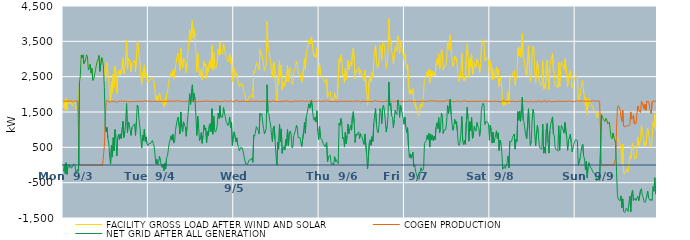
| Category | FACILITY GROSS LOAD AFTER WIND AND SOLAR | COGEN PRODUCTION | NET GRID AFTER ALL GENERATION |
|---|---|---|---|
|  Mon  9/3 | 1620 | 1800 | -180 |
|  Mon  9/3 | 1828 | 1808 | 20 |
|  Mon  9/3 | 1564 | 1807 | -243 |
|  Mon  9/3 | 1877 | 1812 | 65 |
|  Mon  9/3 | 1547 | 1811 | -264 |
|  Mon  9/3 | 1786 | 1816 | -30 |
|  Mon  9/3 | 1826 | 1805 | 21 |
|  Mon  9/3 | 1730 | 1797 | -67 |
|  Mon  9/3 | 1804 | 1817 | -13 |
|  Mon  9/3 | 1721 | 1812 | -91 |
|  Mon  9/3 | 1666 | 1784 | -118 |
|  Mon  9/3 | 1783 | 1788 | -5 |
|  Mon  9/3 | 1842 | 1810 | 32 |
|  Mon  9/3 | 1788 | 1802 | -14 |
|  Mon  9/3 | 1573 | 1814 | -241 |
|  Mon  9/3 | 1558 | 1807 | -249 |
|  Mon  9/3 | 1674 | 1800 | -126 |
|  Mon  9/3 | 1615 | 1794 | -179 |
|  Mon  9/3 | 2334 | 0 | 2334 |
|  Mon  9/3 | 2529 | 0 | 2529 |
|  Mon  9/3 | 3106 | 0 | 3106 |
|  Mon  9/3 | 3029 | 0 | 3029 |
|  Mon  9/3 | 3119 | 0 | 3119 |
|  Mon  9/3 | 2869 | 0 | 2869 |
|  Mon  9/3 | 2872 | 0 | 2872 |
|  Mon  9/3 | 2990 | 0 | 2990 |
|  Mon  9/3 | 3119 | 0 | 3119 |
|  Mon  9/3 | 3068 | 0 | 3068 |
|  Mon  9/3 | 2688 | 0 | 2688 |
|  Mon  9/3 | 2748 | 0 | 2748 |
|  Mon  9/3 | 2850 | 0 | 2850 |
|  Mon  9/3 | 2611 | 0 | 2611 |
|  Mon  9/3 | 2733 | 0 | 2733 |
|  Mon  9/3 | 2392 | 0 | 2392 |
|  Mon  9/3 | 2431 | 0 | 2431 |
|  Mon  9/3 | 2545 | 0 | 2545 |
|  Mon  9/3 | 2681 | 0 | 2681 |
|  Mon  9/3 | 2830 | 0 | 2830 |
|  Mon  9/3 | 2939 | 0 | 2939 |
|  Mon  9/3 | 2993 | 0 | 2993 |
|  Mon  9/3 | 3101 | 0 | 3101 |
|  Mon  9/3 | 2649 | 0 | 2649 |
|  Mon  9/3 | 2665 | 0 | 2665 |
|  Mon  9/3 | 3035 | 0 | 3035 |
|  Mon  9/3 | 2955 | 0 | 2955 |
|  Mon  9/3 | 2806 | 0 | 2806 |
|  Mon  9/3 | 2719 | 530 | 2189 |
|  Mon  9/3 | 2361 | 1263 | 1098 |
|  Mon  9/3 | 2733 | 1798 | 935 |
|  Mon  9/3 | 2897 | 1831 | 1066 |
|  Mon  9/3 | 2556 | 1801 | 755 |
|  Mon  9/3 | 2422 | 1802 | 620 |
|  Mon  9/3 | 2032 | 1781 | 251 |
|  Mon  9/3 | 1816 | 1792 | 24 |
|  Mon  9/3 | 2366 | 1805 | 561 |
|  Mon  9/3 | 2033 | 1809 | 224 |
|  Mon  9/3 | 2572 | 1798 | 774 |
|  Mon  9/3 | 2197 | 1798 | 399 |
|  Mon  9/3 | 2803 | 1801 | 1002 |
|  Mon  9/3 | 2586 | 1807 | 779 |
|  Mon  9/3 | 2029 | 1775 | 254 |
|  Mon  9/3 | 2541 | 1780 | 761 |
|  Mon  9/3 | 2670 | 1802 | 868 |
|  Mon  9/3 | 2544 | 1816 | 728 |
|  Mon  9/3 | 2690 | 1810 | 880 |
|  Mon  9/3 | 2559 | 1810 | 749 |
|  Mon  9/3 | 2541 | 1806 | 735 |
|  Mon  9/3 | 3022 | 1787 | 1235 |
|  Mon  9/3 | 2579 | 1803 | 776 |
|  Mon  9/3 | 2731 | 1799 | 932 |
|  Mon  9/3 | 3030 | 1807 | 1223 |
|  Mon  9/3 | 3539 | 1799 | 1740 |
|  Mon  9/3 | 2712 | 1795 | 917 |
|  Mon  9/3 | 3023 | 1803 | 1220 |
|  Mon  9/3 | 2942 | 1791 | 1151 |
|  Mon  9/3 | 2973 | 1795 | 1178 |
|  Mon  9/3 | 2633 | 1795 | 838 |
|  Mon  9/3 | 2866 | 1804 | 1062 |
|  Mon  9/3 | 2895 | 1795 | 1100 |
|  Mon  9/3 | 2915 | 1806 | 1109 |
|  Mon  9/3 | 2965 | 1800 | 1165 |
|  Mon  9/3 | 2630 | 1796 | 834 |
|  Mon  9/3 | 3017 | 1799 | 1218 |
|  Mon  9/3 | 3505 | 1808 | 1697 |
|  Mon  9/3 | 3436 | 1800 | 1636 |
|  Mon  9/3 | 3077 | 1797 | 1280 |
|  Mon  9/3 | 2880 | 1804 | 1076 |
|  Mon  9/3 | 2576 | 1798 | 778 |
|  Mon  9/3 | 2275 | 1793 | 482 |
|  Mon  9/3 | 2637 | 1800 | 837 |
|  Mon  9/3 | 2498 | 1810 | 688 |
|  Mon  9/3 | 2820 | 1804 | 1016 |
|  Mon  9/3 | 2486 | 1818 | 668 |
|  Mon  9/3 | 2588 | 1793 | 795 |
|  Mon  9/3 | 2414 | 1806 | 608 |
|  Mon  9/3 | 2339 | 1795 | 544 |
|  Tue  9/4 | 2403 | 1800 | 603 |
|  Tue  9/4 | 2415 | 1810 | 605 |
|  Tue  9/4 | 2418 | 1808 | 610 |
|  Tue  9/4 | 2394 | 1809 | 585 |
|  Tue  9/4 | 2489 | 1795 | 694 |
|  Tue  9/4 | 2422 | 1817 | 605 |
|  Tue  9/4 | 2332 | 1806 | 526 |
|  Tue  9/4 | 2324 | 1795 | 529 |
|  Tue  9/4 | 1833 | 1803 | 30 |
|  Tue  9/4 | 1961 | 1804 | 157 |
|  Tue  9/4 | 1810 | 1803 | 7 |
|  Tue  9/4 | 1873 | 1799 | 74 |
|  Tue  9/4 | 2046 | 1800 | 246 |
|  Tue  9/4 | 1919 | 1796 | 123 |
|  Tue  9/4 | 1799 | 1800 | -1 |
|  Tue  9/4 | 1749 | 1820 | -71 |
|  Tue  9/4 | 1818 | 1789 | 29 |
|  Tue  9/4 | 1653 | 1811 | -158 |
|  Tue  9/4 | 1860 | 1808 | 52 |
|  Tue  9/4 | 1699 | 1809 | -110 |
|  Tue  9/4 | 2014 | 1805 | 209 |
|  Tue  9/4 | 2064 | 1818 | 246 |
|  Tue  9/4 | 2255 | 1811 | 444 |
|  Tue  9/4 | 2422 | 1801 | 621 |
|  Tue  9/4 | 2444 | 1804 | 640 |
|  Tue  9/4 | 2607 | 1779 | 828 |
|  Tue  9/4 | 2503 | 1800 | 703 |
|  Tue  9/4 | 2691 | 1821 | 870 |
|  Tue  9/4 | 2432 | 1813 | 619 |
|  Tue  9/4 | 2451 | 1796 | 655 |
|  Tue  9/4 | 2786 | 1806 | 980 |
|  Tue  9/4 | 2940 | 1802 | 1138 |
|  Tue  9/4 | 3099 | 1818 | 1281 |
|  Tue  9/4 | 3159 | 1806 | 1353 |
|  Tue  9/4 | 2923 | 1811 | 1112 |
|  Tue  9/4 | 2681 | 1802 | 879 |
|  Tue  9/4 | 3297 | 1796 | 1501 |
|  Tue  9/4 | 2869 | 1794 | 1075 |
|  Tue  9/4 | 2748 | 1805 | 943 |
|  Tue  9/4 | 3029 | 1806 | 1223 |
|  Tue  9/4 | 2933 | 1799 | 1134 |
|  Tue  9/4 | 2885 | 1796 | 1089 |
|  Tue  9/4 | 2612 | 1799 | 813 |
|  Tue  9/4 | 2873 | 1799 | 1074 |
|  Tue  9/4 | 3221 | 1813 | 1408 |
|  Tue  9/4 | 3468 | 1794 | 1674 |
|  Tue  9/4 | 3832 | 1811 | 2021 |
|  Tue  9/4 | 3516 | 1799 | 1717 |
|  Tue  9/4 | 3510 | 1817 | 1693 |
|  Tue  9/4 | 4083 | 1815 | 2268 |
|  Tue  9/4 | 3582 | 1780 | 1802 |
|  Tue  9/4 | 3843 | 1818 | 2025 |
|  Tue  9/4 | 3658 | 1813 | 1845 |
|  Tue  9/4 | 3132 | 1788 | 1344 |
|  Tue  9/4 | 2648 | 1811 | 837 |
|  Tue  9/4 | 3167 | 1791 | 1376 |
|  Tue  9/4 | 2890 | 1814 | 1076 |
|  Tue  9/4 | 2500 | 1805 | 695 |
|  Tue  9/4 | 2585 | 1819 | 766 |
|  Tue  9/4 | 2726 | 1806 | 920 |
|  Tue  9/4 | 2417 | 1804 | 613 |
|  Tue  9/4 | 2632 | 1794 | 838 |
|  Tue  9/4 | 2938 | 1805 | 1133 |
|  Tue  9/4 | 2800 | 1811 | 989 |
|  Tue  9/4 | 2861 | 1811 | 1050 |
|  Tue  9/4 | 2443 | 1810 | 633 |
|  Tue  9/4 | 2755 | 1810 | 945 |
|  Tue  9/4 | 2643 | 1809 | 834 |
|  Tue  9/4 | 2901 | 1792 | 1109 |
|  Tue  9/4 | 2971 | 1801 | 1170 |
|  Tue  9/4 | 2755 | 1811 | 944 |
|  Tue  9/4 | 3391 | 1796 | 1595 |
|  Tue  9/4 | 2686 | 1814 | 872 |
|  Tue  9/4 | 3187 | 1806 | 1381 |
|  Tue  9/4 | 2787 | 1800 | 987 |
|  Tue  9/4 | 2733 | 1803 | 930 |
|  Tue  9/4 | 2790 | 1794 | 996 |
|  Tue  9/4 | 2943 | 1805 | 1138 |
|  Tue  9/4 | 3278 | 1808 | 1470 |
|  Tue  9/4 | 3106 | 1790 | 1316 |
|  Tue  9/4 | 3485 | 1807 | 1678 |
|  Tue  9/4 | 3154 | 1802 | 1352 |
|  Tue  9/4 | 3164 | 1796 | 1368 |
|  Tue  9/4 | 3153 | 1796 | 1357 |
|  Tue  9/4 | 3429 | 1806 | 1623 |
|  Tue  9/4 | 3274 | 1809 | 1465 |
|  Tue  9/4 | 3175 | 1804 | 1371 |
|  Tue  9/4 | 3036 | 1808 | 1228 |
|  Tue  9/4 | 3043 | 1805 | 1238 |
|  Tue  9/4 | 2922 | 1806 | 1116 |
|  Tue  9/4 | 3005 | 1804 | 1201 |
|  Tue  9/4 | 3146 | 1796 | 1350 |
|  Tue  9/4 | 2869 | 1817 | 1052 |
|  Tue  9/4 | 3039 | 1823 | 1216 |
|  Tue  9/4 | 2352 | 1804 | 548 |
|  Tue  9/4 | 2618 | 1782 | 836 |
|  Wed  9/5 | 2733 | 1795 | 938 |
|  Wed  9/5 | 2749 | 1809 | 940 |
|  Wed  9/5 | 2467 | 1806 | 661 |
|  Wed  9/5 | 2589 | 1822 | 767 |
|  Wed  9/5 | 2377 | 1802 | 575 |
|  Wed  9/5 | 2296 | 1802 | 494 |
|  Wed  9/5 | 2210 | 1812 | 398 |
|  Wed  9/5 | 2285 | 1797 | 488 |
|  Wed  9/5 | 2275 | 1807 | 468 |
|  Wed  9/5 | 2295 | 1809 | 486 |
|  Wed  9/5 | 2192 | 1802 | 390 |
|  Wed  9/5 | 2056 | 1809 | 247 |
|  Wed  9/5 | 2026 | 1796 | 230 |
|  Wed  9/5 | 1825 | 1798 | 27 |
|  Wed  9/5 | 1846 | 1799 | 47 |
|  Wed  9/5 | 1825 | 1799 | 26 |
|  Wed  9/5 | 1802 | 1801 | 1 |
|  Wed  9/5 | 1947 | 1802 | 145 |
|  Wed  9/5 | 1935 | 1805 | 130 |
|  Wed  9/5 | 1949 | 1801 | 148 |
|  Wed  9/5 | 1991 | 1789 | 202 |
|  Wed  9/5 | 1890 | 1814 | 76 |
|  Wed  9/5 | 2654 | 1804 | 850 |
|  Wed  9/5 | 2609 | 1794 | 815 |
|  Wed  9/5 | 2600 | 1796 | 804 |
|  Wed  9/5 | 2899 | 1813 | 1086 |
|  Wed  9/5 | 2824 | 1804 | 1020 |
|  Wed  9/5 | 2764 | 1788 | 976 |
|  Wed  9/5 | 2686 | 1804 | 882 |
|  Wed  9/5 | 3266 | 1803 | 1463 |
|  Wed  9/5 | 3226 | 1803 | 1423 |
|  Wed  9/5 | 3253 | 1801 | 1452 |
|  Wed  9/5 | 3028 | 1811 | 1217 |
|  Wed  9/5 | 2845 | 1806 | 1039 |
|  Wed  9/5 | 2674 | 1798 | 876 |
|  Wed  9/5 | 2760 | 1802 | 958 |
|  Wed  9/5 | 2825 | 1803 | 1022 |
|  Wed  9/5 | 4068 | 1798 | 2270 |
|  Wed  9/5 | 3284 | 1798 | 1486 |
|  Wed  9/5 | 3254 | 1806 | 1448 |
|  Wed  9/5 | 3054 | 1803 | 1251 |
|  Wed  9/5 | 2922 | 1790 | 1132 |
|  Wed  9/5 | 2641 | 1806 | 835 |
|  Wed  9/5 | 2477 | 1813 | 664 |
|  Wed  9/5 | 2838 | 1791 | 1047 |
|  Wed  9/5 | 2912 | 1807 | 1105 |
|  Wed  9/5 | 2518 | 1801 | 717 |
|  Wed  9/5 | 2071 | 1799 | 272 |
|  Wed  9/5 | 1788 | 1795 | -7 |
|  Wed  9/5 | 2451 | 1800 | 651 |
|  Wed  9/5 | 2266 | 1819 | 447 |
|  Wed  9/5 | 2950 | 1794 | 1156 |
|  Wed  9/5 | 2477 | 1810 | 667 |
|  Wed  9/5 | 2828 | 1805 | 1023 |
|  Wed  9/5 | 2133 | 1803 | 330 |
|  Wed  9/5 | 2292 | 1805 | 487 |
|  Wed  9/5 | 2335 | 1813 | 522 |
|  Wed  9/5 | 2227 | 1804 | 423 |
|  Wed  9/5 | 2526 | 1804 | 722 |
|  Wed  9/5 | 2360 | 1815 | 545 |
|  Wed  9/5 | 2814 | 1804 | 1010 |
|  Wed  9/5 | 2359 | 1808 | 551 |
|  Wed  9/5 | 2696 | 1793 | 903 |
|  Wed  9/5 | 2751 | 1788 | 963 |
|  Wed  9/5 | 2677 | 1800 | 877 |
|  Wed  9/5 | 2272 | 1788 | 484 |
|  Wed  9/5 | 2309 | 1794 | 515 |
|  Wed  9/5 | 2630 | 1804 | 826 |
|  Wed  9/5 | 2624 | 1812 | 812 |
|  Wed  9/5 | 2792 | 1808 | 984 |
|  Wed  9/5 | 2932 | 1807 | 1125 |
|  Wed  9/5 | 2851 | 1801 | 1050 |
|  Wed  9/5 | 2582 | 1803 | 779 |
|  Wed  9/5 | 2567 | 1812 | 755 |
|  Wed  9/5 | 2576 | 1798 | 778 |
|  Wed  9/5 | 2432 | 1805 | 627 |
|  Wed  9/5 | 2335 | 1814 | 521 |
|  Wed  9/5 | 2312 | 1815 | 497 |
|  Wed  9/5 | 2730 | 1801 | 929 |
|  Wed  9/5 | 3010 | 1798 | 1212 |
|  Wed  9/5 | 2694 | 1797 | 897 |
|  Wed  9/5 | 3150 | 1809 | 1341 |
|  Wed  9/5 | 3264 | 1805 | 1459 |
|  Wed  9/5 | 3415 | 1803 | 1612 |
|  Wed  9/5 | 3547 | 1815 | 1732 |
|  Wed  9/5 | 3417 | 1809 | 1608 |
|  Wed  9/5 | 3403 | 1814 | 1589 |
|  Wed  9/5 | 3621 | 1792 | 1829 |
|  Wed  9/5 | 3396 | 1805 | 1591 |
|  Wed  9/5 | 3134 | 1807 | 1327 |
|  Wed  9/5 | 3070 | 1807 | 1263 |
|  Wed  9/5 | 3150 | 1795 | 1355 |
|  Wed  9/5 | 3045 | 1822 | 1223 |
|  Wed  9/5 | 3322 | 1789 | 1533 |
|  Wed  9/5 | 2755 | 1808 | 947 |
|  Wed  9/5 | 2533 | 1819 | 714 |
|  Thu  9/6 | 2885 | 1792 | 1093 |
|  Thu  9/6 | 2576 | 1794 | 782 |
|  Thu  9/6 | 2557 | 1797 | 760 |
|  Thu  9/6 | 2492 | 1796 | 696 |
|  Thu  9/6 | 2424 | 1805 | 619 |
|  Thu  9/6 | 2450 | 1817 | 633 |
|  Thu  9/6 | 2327 | 1815 | 512 |
|  Thu  9/6 | 2313 | 1802 | 511 |
|  Thu  9/6 | 2441 | 1803 | 638 |
|  Thu  9/6 | 1899 | 1811 | 88 |
|  Thu  9/6 | 2025 | 1787 | 238 |
|  Thu  9/6 | 2024 | 1801 | 223 |
|  Thu  9/6 | 2085 | 1807 | 278 |
|  Thu  9/6 | 1849 | 1794 | 55 |
|  Thu  9/6 | 1828 | 1816 | 12 |
|  Thu  9/6 | 1850 | 1795 | 55 |
|  Thu  9/6 | 1813 | 1804 | 9 |
|  Thu  9/6 | 2040 | 1805 | 235 |
|  Thu  9/6 | 1898 | 1800 | 98 |
|  Thu  9/6 | 1933 | 1785 | 148 |
|  Thu  9/6 | 1870 | 1793 | 77 |
|  Thu  9/6 | 1845 | 1806 | 39 |
|  Thu  9/6 | 2990 | 1805 | 1185 |
|  Thu  9/6 | 2920 | 1800 | 1120 |
|  Thu  9/6 | 3117 | 1804 | 1313 |
|  Thu  9/6 | 3002 | 1813 | 1189 |
|  Thu  9/6 | 2541 | 1796 | 745 |
|  Thu  9/6 | 2581 | 1801 | 780 |
|  Thu  9/6 | 2323 | 1816 | 507 |
|  Thu  9/6 | 2728 | 1805 | 923 |
|  Thu  9/6 | 2408 | 1807 | 601 |
|  Thu  9/6 | 2622 | 1801 | 821 |
|  Thu  9/6 | 2964 | 1803 | 1161 |
|  Thu  9/6 | 2697 | 1809 | 888 |
|  Thu  9/6 | 2822 | 1797 | 1025 |
|  Thu  9/6 | 2923 | 1801 | 1122 |
|  Thu  9/6 | 2791 | 1807 | 984 |
|  Thu  9/6 | 3185 | 1791 | 1394 |
|  Thu  9/6 | 3315 | 1805 | 1510 |
|  Thu  9/6 | 2987 | 1813 | 1174 |
|  Thu  9/6 | 2440 | 1804 | 636 |
|  Thu  9/6 | 2682 | 1802 | 880 |
|  Thu  9/6 | 2650 | 1810 | 840 |
|  Thu  9/6 | 2633 | 1814 | 819 |
|  Thu  9/6 | 2761 | 1823 | 938 |
|  Thu  9/6 | 2545 | 1800 | 745 |
|  Thu  9/6 | 2679 | 1792 | 887 |
|  Thu  9/6 | 2609 | 1781 | 828 |
|  Thu  9/6 | 2603 | 1815 | 788 |
|  Thu  9/6 | 2462 | 1797 | 665 |
|  Thu  9/6 | 2381 | 1801 | 580 |
|  Thu  9/6 | 2677 | 1800 | 877 |
|  Thu  9/6 | 2651 | 1799 | 852 |
|  Thu  9/6 | 2111 | 1812 | 299 |
|  Thu  9/6 | 1688 | 1802 | -114 |
|  Thu  9/6 | 1678 | 1801 | -123 |
|  Thu  9/6 | 2418 | 1799 | 619 |
|  Thu  9/6 | 2502 | 1788 | 714 |
|  Thu  9/6 | 2364 | 1804 | 560 |
|  Thu  9/6 | 2612 | 1812 | 800 |
|  Thu  9/6 | 2460 | 1791 | 669 |
|  Thu  9/6 | 2978 | 1803 | 1175 |
|  Thu  9/6 | 3238 | 1821 | 1417 |
|  Thu  9/6 | 3399 | 1798 | 1601 |
|  Thu  9/6 | 2960 | 1806 | 1154 |
|  Thu  9/6 | 2730 | 1780 | 950 |
|  Thu  9/6 | 2716 | 1805 | 911 |
|  Thu  9/6 | 2940 | 1796 | 1144 |
|  Thu  9/6 | 3394 | 1802 | 1592 |
|  Thu  9/6 | 3317 | 1804 | 1513 |
|  Thu  9/6 | 2964 | 1792 | 1172 |
|  Thu  9/6 | 3441 | 1810 | 1631 |
|  Thu  9/6 | 3489 | 1794 | 1695 |
|  Thu  9/6 | 3341 | 1810 | 1531 |
|  Thu  9/6 | 3348 | 1805 | 1543 |
|  Thu  9/6 | 2737 | 1804 | 933 |
|  Thu  9/6 | 2899 | 1807 | 1092 |
|  Thu  9/6 | 3171 | 1801 | 1370 |
|  Thu  9/6 | 4147 | 1802 | 2345 |
|  Thu  9/6 | 3487 | 1804 | 1683 |
|  Thu  9/6 | 3545 | 1795 | 1750 |
|  Thu  9/6 | 3201 | 1801 | 1400 |
|  Thu  9/6 | 3156 | 1807 | 1349 |
|  Thu  9/6 | 2862 | 1802 | 1060 |
|  Thu  9/6 | 3070 | 1794 | 1276 |
|  Thu  9/6 | 3342 | 1796 | 1546 |
|  Thu  9/6 | 3268 | 1799 | 1469 |
|  Thu  9/6 | 3217 | 1796 | 1421 |
|  Thu  9/6 | 3658 | 1816 | 1842 |
|  Thu  9/6 | 3554 | 1802 | 1752 |
|  Thu  9/6 | 3155 | 1805 | 1350 |
|  Thu  9/6 | 3498 | 1803 | 1695 |
|  Thu  9/6 | 3370 | 1789 | 1581 |
|  Thu  9/6 | 3387 | 1813 | 1574 |
|  Thu  9/6 | 3136 | 1806 | 1330 |
|  Thu  9/6 | 2958 | 1806 | 1152 |
|  Fri  9/7 | 3144 | 1789 | 1355 |
|  Fri  9/7 | 2862 | 1800 | 1062 |
|  Fri  9/7 | 2723 | 1800 | 923 |
|  Fri  9/7 | 2842 | 1786 | 1056 |
|  Fri  9/7 | 2340 | 1805 | 535 |
|  Fri  9/7 | 2016 | 1799 | 217 |
|  Fri  9/7 | 2126 | 1813 | 313 |
|  Fri  9/7 | 2006 | 1813 | 193 |
|  Fri  9/7 | 1997 | 1799 | 198 |
|  Fri  9/7 | 2166 | 1809 | 357 |
|  Fri  9/7 | 1761 | 1802 | -41 |
|  Fri  9/7 | 1823 | 1813 | 10 |
|  Fri  9/7 | 1623 | 1794 | -171 |
|  Fri  9/7 | 1661 | 1809 | -148 |
|  Fri  9/7 | 1442 | 1809 | -367 |
|  Fri  9/7 | 1432 | 1807 | -375 |
|  Fri  9/7 | 1389 | 1792 | -403 |
|  Fri  9/7 | 1579 | 1800 | -221 |
|  Fri  9/7 | 1727 | 1804 | -77 |
|  Fri  9/7 | 1644 | 1806 | -162 |
|  Fri  9/7 | 1677 | 1811 | -134 |
|  Fri  9/7 | 1678 | 1803 | -125 |
|  Fri  9/7 | 2419 | 1803 | 616 |
|  Fri  9/7 | 2424 | 1785 | 639 |
|  Fri  9/7 | 2487 | 1797 | 690 |
|  Fri  9/7 | 2635 | 1795 | 840 |
|  Fri  9/7 | 2528 | 1801 | 727 |
|  Fri  9/7 | 2704 | 1808 | 896 |
|  Fri  9/7 | 2327 | 1820 | 507 |
|  Fri  9/7 | 2682 | 1806 | 876 |
|  Fri  9/7 | 2518 | 1809 | 709 |
|  Fri  9/7 | 2649 | 1810 | 839 |
|  Fri  9/7 | 2505 | 1816 | 689 |
|  Fri  9/7 | 2613 | 1802 | 811 |
|  Fri  9/7 | 2531 | 1814 | 717 |
|  Fri  9/7 | 2863 | 1799 | 1064 |
|  Fri  9/7 | 2987 | 1797 | 1190 |
|  Fri  9/7 | 2840 | 1804 | 1036 |
|  Fri  9/7 | 3147 | 1807 | 1340 |
|  Fri  9/7 | 2724 | 1806 | 918 |
|  Fri  9/7 | 2810 | 1807 | 1003 |
|  Fri  9/7 | 3274 | 1802 | 1472 |
|  Fri  9/7 | 3186 | 1802 | 1384 |
|  Fri  9/7 | 2687 | 1795 | 892 |
|  Fri  9/7 | 2789 | 1804 | 985 |
|  Fri  9/7 | 2768 | 1803 | 965 |
|  Fri  9/7 | 2813 | 1810 | 1003 |
|  Fri  9/7 | 3032 | 1793 | 1239 |
|  Fri  9/7 | 3503 | 1821 | 1682 |
|  Fri  9/7 | 3258 | 1808 | 1450 |
|  Fri  9/7 | 3243 | 1811 | 1432 |
|  Fri  9/7 | 3672 | 1812 | 1860 |
|  Fri  9/7 | 3225 | 1796 | 1429 |
|  Fri  9/7 | 2970 | 1803 | 1167 |
|  Fri  9/7 | 2783 | 1800 | 983 |
|  Fri  9/7 | 2887 | 1800 | 1087 |
|  Fri  9/7 | 3087 | 1792 | 1295 |
|  Fri  9/7 | 2979 | 1811 | 1168 |
|  Fri  9/7 | 3030 | 1804 | 1226 |
|  Fri  9/7 | 2756 | 1808 | 948 |
|  Fri  9/7 | 2410 | 1804 | 606 |
|  Fri  9/7 | 2356 | 1805 | 551 |
|  Fri  9/7 | 2450 | 1806 | 644 |
|  Fri  9/7 | 2687 | 1777 | 910 |
|  Fri  9/7 | 3173 | 1800 | 1373 |
|  Fri  9/7 | 2488 | 1807 | 681 |
|  Fri  9/7 | 2390 | 1809 | 581 |
|  Fri  9/7 | 2516 | 1819 | 697 |
|  Fri  9/7 | 2375 | 1792 | 583 |
|  Fri  9/7 | 3001 | 1795 | 1206 |
|  Fri  9/7 | 3430 | 1794 | 1636 |
|  Fri  9/7 | 3108 | 1801 | 1307 |
|  Fri  9/7 | 2472 | 1798 | 674 |
|  Fri  9/7 | 3016 | 1791 | 1225 |
|  Fri  9/7 | 2779 | 1814 | 965 |
|  Fri  9/7 | 3149 | 1807 | 1342 |
|  Fri  9/7 | 2564 | 1811 | 753 |
|  Fri  9/7 | 2628 | 1799 | 829 |
|  Fri  9/7 | 2910 | 1814 | 1096 |
|  Fri  9/7 | 2804 | 1806 | 998 |
|  Fri  9/7 | 2757 | 1797 | 960 |
|  Fri  9/7 | 3005 | 1801 | 1204 |
|  Fri  9/7 | 2909 | 1810 | 1099 |
|  Fri  9/7 | 2859 | 1796 | 1063 |
|  Fri  9/7 | 2613 | 1801 | 812 |
|  Fri  9/7 | 2852 | 1813 | 1039 |
|  Fri  9/7 | 3340 | 1804 | 1536 |
|  Fri  9/7 | 3484 | 1795 | 1689 |
|  Fri  9/7 | 3553 | 1807 | 1746 |
|  Fri  9/7 | 3485 | 1811 | 1674 |
|  Fri  9/7 | 2945 | 1797 | 1148 |
|  Fri  9/7 | 3038 | 1811 | 1227 |
|  Fri  9/7 | 3016 | 1814 | 1202 |
|  Fri  9/7 | 3016 | 1801 | 1215 |
|  Fri  9/7 | 2959 | 1803 | 1156 |
|  Fri  9/7 | 2503 | 1802 | 701 |
|  Sat  9/8 | 2938 | 1808 | 1130 |
|  Sat  9/8 | 2780 | 1799 | 981 |
|  Sat  9/8 | 2420 | 1798 | 622 |
|  Sat  9/8 | 2731 | 1801 | 930 |
|  Sat  9/8 | 2430 | 1796 | 634 |
|  Sat  9/8 | 2533 | 1807 | 726 |
|  Sat  9/8 | 2672 | 1810 | 862 |
|  Sat  9/8 | 2764 | 1797 | 967 |
|  Sat  9/8 | 2554 | 1806 | 748 |
|  Sat  9/8 | 2712 | 1803 | 909 |
|  Sat  9/8 | 2211 | 1802 | 409 |
|  Sat  9/8 | 2487 | 1786 | 701 |
|  Sat  9/8 | 2420 | 1802 | 618 |
|  Sat  9/8 | 2140 | 1789 | 351 |
|  Sat  9/8 | 1702 | 1822 | -120 |
|  Sat  9/8 | 1671 | 1794 | -123 |
|  Sat  9/8 | 1794 | 1818 | -24 |
|  Sat  9/8 | 1689 | 1789 | -100 |
|  Sat  9/8 | 1803 | 1813 | -10 |
|  Sat  9/8 | 1853 | 1793 | 60 |
|  Sat  9/8 | 2070 | 1814 | 256 |
|  Sat  9/8 | 1730 | 1810 | -80 |
|  Sat  9/8 | 2469 | 1801 | 668 |
|  Sat  9/8 | 2485 | 1794 | 691 |
|  Sat  9/8 | 2477 | 1806 | 671 |
|  Sat  9/8 | 2586 | 1808 | 778 |
|  Sat  9/8 | 2568 | 1790 | 778 |
|  Sat  9/8 | 2674 | 1795 | 879 |
|  Sat  9/8 | 2249 | 1799 | 450 |
|  Sat  9/8 | 2520 | 1794 | 726 |
|  Sat  9/8 | 2477 | 1806 | 671 |
|  Sat  9/8 | 3315 | 1804 | 1511 |
|  Sat  9/8 | 3087 | 1824 | 1263 |
|  Sat  9/8 | 3327 | 1800 | 1527 |
|  Sat  9/8 | 3044 | 1807 | 1237 |
|  Sat  9/8 | 3377 | 1817 | 1560 |
|  Sat  9/8 | 3727 | 1810 | 1917 |
|  Sat  9/8 | 3062 | 1797 | 1265 |
|  Sat  9/8 | 3024 | 1818 | 1206 |
|  Sat  9/8 | 2798 | 1807 | 991 |
|  Sat  9/8 | 2608 | 1787 | 821 |
|  Sat  9/8 | 2542 | 1797 | 745 |
|  Sat  9/8 | 2538 | 1785 | 753 |
|  Sat  9/8 | 3371 | 1779 | 1592 |
|  Sat  9/8 | 2815 | 1809 | 1006 |
|  Sat  9/8 | 2366 | 1812 | 554 |
|  Sat  9/8 | 2472 | 1802 | 670 |
|  Sat  9/8 | 3067 | 1816 | 1251 |
|  Sat  9/8 | 3357 | 1783 | 1574 |
|  Sat  9/8 | 3277 | 1811 | 1466 |
|  Sat  9/8 | 2686 | 1807 | 879 |
|  Sat  9/8 | 2323 | 1785 | 538 |
|  Sat  9/8 | 2704 | 1778 | 926 |
|  Sat  9/8 | 2945 | 1814 | 1131 |
|  Sat  9/8 | 2693 | 1802 | 891 |
|  Sat  9/8 | 2372 | 1796 | 576 |
|  Sat  9/8 | 2280 | 1810 | 470 |
|  Sat  9/8 | 2261 | 1812 | 449 |
|  Sat  9/8 | 2229 | 1781 | 448 |
|  Sat  9/8 | 2956 | 1797 | 1159 |
|  Sat  9/8 | 2151 | 1815 | 336 |
|  Sat  9/8 | 2299 | 1794 | 505 |
|  Sat  9/8 | 2149 | 1817 | 332 |
|  Sat  9/8 | 2795 | 1775 | 1020 |
|  Sat  9/8 | 2971 | 1796 | 1175 |
|  Sat  9/8 | 2439 | 1808 | 631 |
|  Sat  9/8 | 2136 | 1799 | 337 |
|  Sat  9/8 | 2774 | 1808 | 966 |
|  Sat  9/8 | 2956 | 1805 | 1151 |
|  Sat  9/8 | 3054 | 1785 | 1269 |
|  Sat  9/8 | 3161 | 1799 | 1362 |
|  Sat  9/8 | 2683 | 1803 | 880 |
|  Sat  9/8 | 2632 | 1807 | 825 |
|  Sat  9/8 | 2272 | 1789 | 483 |
|  Sat  9/8 | 2226 | 1781 | 445 |
|  Sat  9/8 | 2274 | 1801 | 473 |
|  Sat  9/8 | 2179 | 1786 | 393 |
|  Sat  9/8 | 2914 | 1805 | 1109 |
|  Sat  9/8 | 2213 | 1799 | 414 |
|  Sat  9/8 | 2693 | 1801 | 892 |
|  Sat  9/8 | 2925 | 1805 | 1120 |
|  Sat  9/8 | 2875 | 1803 | 1072 |
|  Sat  9/8 | 2874 | 1812 | 1062 |
|  Sat  9/8 | 2703 | 1800 | 903 |
|  Sat  9/8 | 3006 | 1801 | 1205 |
|  Sat  9/8 | 3016 | 1807 | 1209 |
|  Sat  9/8 | 2564 | 1797 | 767 |
|  Sat  9/8 | 2208 | 1793 | 415 |
|  Sat  9/8 | 2500 | 1803 | 697 |
|  Sat  9/8 | 2524 | 1815 | 709 |
|  Sat  9/8 | 2666 | 1796 | 870 |
|  Sat  9/8 | 2445 | 1798 | 647 |
|  Sat  9/8 | 2188 | 1811 | 377 |
|  Sat  9/8 | 2283 | 1790 | 493 |
|  Sat  9/8 | 2297 | 1804 | 493 |
|  Sat  9/8 | 2471 | 1798 | 673 |
|  Sun  9/9 | 2533 | 1812 | 721 |
|  Sun  9/9 | 2528 | 1816 | 712 |
|  Sun  9/9 | 2503 | 1816 | 687 |
|  Sun  9/9 | 1806 | 1812 | -6 |
|  Sun  9/9 | 1805 | 1804 | 1 |
|  Sun  9/9 | 1999 | 1809 | 190 |
|  Sun  9/9 | 2012 | 1812 | 200 |
|  Sun  9/9 | 2339 | 1810 | 529 |
|  Sun  9/9 | 2389 | 1803 | 586 |
|  Sun  9/9 | 2063 | 1810 | 253 |
|  Sun  9/9 | 1958 | 1788 | 170 |
|  Sun  9/9 | 1676 | 1808 | -132 |
|  Sun  9/9 | 1901 | 1796 | 105 |
|  Sun  9/9 | 1435 | 1803 | -368 |
|  Sun  9/9 | 1750 | 1803 | -53 |
|  Sun  9/9 | 1878 | 1812 | 66 |
|  Sun  9/9 | 1781 | 1810 | -29 |
|  Sun  9/9 | 1757 | 1798 | -41 |
|  Sun  9/9 | 1699 | 1808 | -109 |
|  Sun  9/9 | 1646 | 1821 | -175 |
|  Sun  9/9 | 1583 | 1807 | -224 |
|  Sun  9/9 | 1575 | 1811 | -236 |
|  Sun  9/9 | 1539 | 1804 | -265 |
|  Sun  9/9 | 1444 | 1804 | -360 |
|  Sun  9/9 | 1334 | 1780 | -446 |
|  Sun  9/9 | 1405 | 1814 | -409 |
|  Sun  9/9 | 1485 | 1794 | -309 |
|  Sun  9/9 | 1373 | 1806 | -433 |
|  Sun  9/9 | 1348 | 1804 | -456 |
|  Sun  9/9 | 1421 | 0 | 1421 |
|  Sun  9/9 | 1349 | 0 | 1349 |
|  Sun  9/9 | 1306 | 0 | 1306 |
|  Sun  9/9 | 1319 | 0 | 1319 |
|  Sun  9/9 | 1225 | 0 | 1225 |
|  Sun  9/9 | 1327 | 0 | 1327 |
|  Sun  9/9 | 1295 | 0 | 1295 |
|  Sun  9/9 | 1166 | 0 | 1166 |
|  Sun  9/9 | 1170 | 0 | 1170 |
|  Sun  9/9 | 1213 | 0 | 1213 |
|  Sun  9/9 | 960 | 0 | 960 |
|  Sun  9/9 | 775 | 0 | 775 |
|  Sun  9/9 | 737 | 0 | 737 |
|  Sun  9/9 | 907 | 0 | 907 |
|  Sun  9/9 | 793 | 0 | 793 |
|  Sun  9/9 | 714 | 0 | 714 |
|  Sun  9/9 | 818 | 208 | 610 |
|  Sun  9/9 | 818 | 1026 | -208 |
|  Sun  9/9 | 767 | 1611 | -844 |
|  Sun  9/9 | 708 | 1682 | -974 |
|  Sun  9/9 | 698 | 1692 | -994 |
|  Sun  9/9 | 570 | 1577 | -1007 |
|  Sun  9/9 | 479 | 1352 | -873 |
|  Sun  9/9 | 28 | 1237 | -1209 |
|  Sun  9/9 | 585 | 1545 | -960 |
|  Sun  9/9 | -208 | 1102 | -1310 |
|  Sun  9/9 | -259 | 1087 | -1346 |
|  Sun  9/9 | -236 | 1080 | -1316 |
|  Sun  9/9 | -105 | 1111 | -1216 |
|  Sun  9/9 | -106 | 1097 | -1203 |
|  Sun  9/9 | -209 | 1105 | -1314 |
|  Sun  9/9 | 40 | 1102 | -1062 |
|  Sun  9/9 | 260 | 1144 | -884 |
|  Sun  9/9 | 172 | 1503 | -1331 |
|  Sun  9/9 | 492 | 1296 | -804 |
|  Sun  9/9 | 624 | 1333 | -709 |
|  Sun  9/9 | 398 | 1407 | -1009 |
|  Sun  9/9 | 168 | 1163 | -995 |
|  Sun  9/9 | 219 | 1162 | -943 |
|  Sun  9/9 | 172 | 1176 | -1004 |
|  Sun  9/9 | 443 | 1468 | -1025 |
|  Sun  9/9 | 790 | 1673 | -883 |
|  Sun  9/9 | 524 | 1534 | -1010 |
|  Sun  9/9 | 571 | 1554 | -983 |
|  Sun  9/9 | 777 | 1489 | -712 |
|  Sun  9/9 | 1133 | 1802 | -669 |
|  Sun  9/9 | 944 | 1812 | -868 |
|  Sun  9/9 | 757 | 1674 | -917 |
|  Sun  9/9 | 547 | 1581 | -1034 |
|  Sun  9/9 | 651 | 1714 | -1063 |
|  Sun  9/9 | 554 | 1546 | -992 |
|  Sun  9/9 | 834 | 1805 | -971 |
|  Sun  9/9 | 1043 | 1788 | -745 |
|  Sun  9/9 | 869 | 1802 | -933 |
|  Sun  9/9 | 729 | 1671 | -942 |
|  Sun  9/9 | 525 | 1533 | -1008 |
|  Sun  9/9 | 494 | 1458 | -964 |
|  Sun  9/9 | 777 | 1783 | -1006 |
|  Sun  9/9 | 1198 | 1816 | -618 |
|  Sun  9/9 | 1066 | 1810 | -744 |
|  Sun  9/9 | 1438 | 1799 | -361 |
|  Sun  9/9 | 986 | 1804 | -818 |
|  Sun  9/9 | 968 | 1818 | -850 |